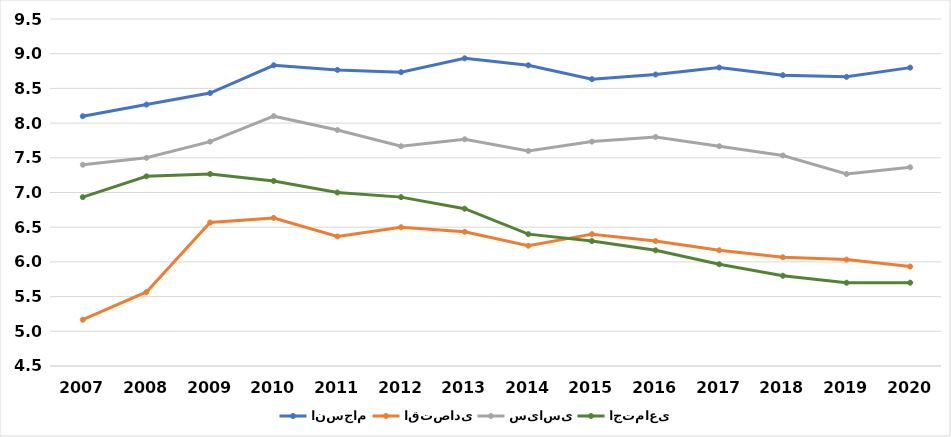
| Category | انسجام | اقتصادی | سیاسی | اجتماعی |
|---|---|---|---|---|
| 2007.0 | 8.1 | 5.167 | 7.4 | 6.933 |
| 2008.0 | 8.267 | 5.567 | 7.5 | 7.233 |
| 2009.0 | 8.433 | 6.567 | 7.733 | 7.267 |
| 2010.0 | 8.833 | 6.633 | 8.1 | 7.167 |
| 2011.0 | 8.767 | 6.367 | 7.9 | 7 |
| 2012.0 | 8.733 | 6.5 | 7.667 | 6.933 |
| 2013.0 | 8.933 | 6.433 | 7.767 | 6.767 |
| 2014.0 | 8.833 | 6.233 | 7.6 | 6.4 |
| 2015.0 | 8.633 | 6.4 | 7.733 | 6.3 |
| 2016.0 | 8.7 | 6.3 | 7.8 | 6.167 |
| 2017.0 | 8.8 | 6.167 | 7.667 | 5.967 |
| 2018.0 | 8.69 | 6.067 | 7.533 | 5.8 |
| 2019.0 | 8.667 | 6.033 | 7.267 | 5.7 |
| 2020.0 | 8.799 | 5.933 | 7.363 | 5.7 |